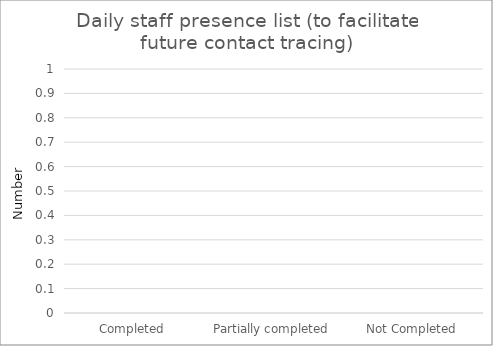
| Category | Daily staff presence list (to facilitate future contact tracing) |
|---|---|
| Completed | 0 |
| Partially completed | 0 |
| Not Completed | 0 |